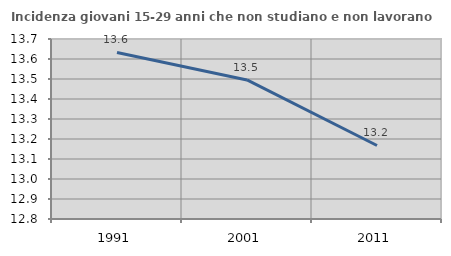
| Category | Incidenza giovani 15-29 anni che non studiano e non lavorano  |
|---|---|
| 1991.0 | 13.633 |
| 2001.0 | 13.495 |
| 2011.0 | 13.168 |